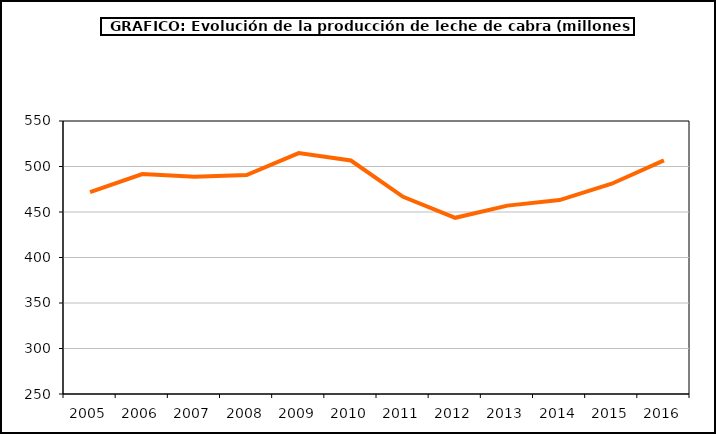
| Category | leche cabra |
|---|---|
| 2005.0 | 471.877 |
| 2006.0 | 491.735 |
| 2007.0 | 488.746 |
| 2008.0 | 490.682 |
| 2009.0 | 514.737 |
| 2010.0 | 506.6 |
| 2011.0 | 466.702 |
| 2012.0 | 443.625 |
| 2013.0 | 457.031 |
| 2014.0 | 463.094 |
| 2015.0 | 481.089 |
| 2016.0 | 506.795 |